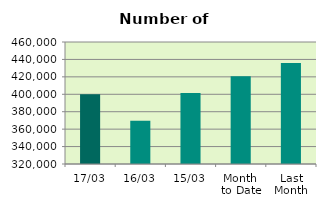
| Category | Series 0 |
|---|---|
| 17/03 | 400024 |
| 16/03 | 369492 |
| 15/03 | 401470 |
| Month 
to Date | 420709.692 |
| Last
Month | 435925.8 |